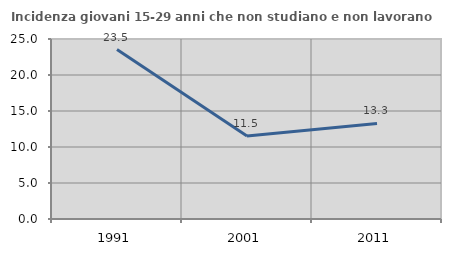
| Category | Incidenza giovani 15-29 anni che non studiano e non lavorano  |
|---|---|
| 1991.0 | 23.529 |
| 2001.0 | 11.525 |
| 2011.0 | 13.278 |